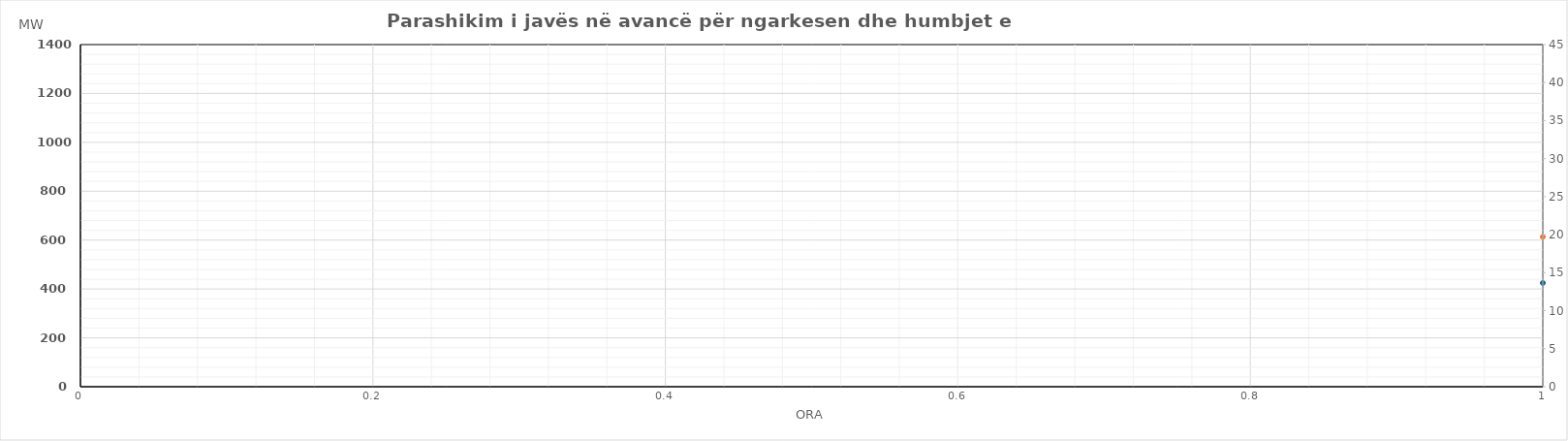
| Category | Ngarkesa (MWh) |
|---|---|
| 0 | 613.19 |
| 1 | 549.8 |
| 2 | 565.19 |
| 3 | 551.39 |
| 4 | 561.67 |
| 5 | 630.08 |
| 6 | 814.47 |
| 7 | 1036.56 |
| 8 | 1102.48 |
| 9 | 1117.12 |
| 10 | 1083.01 |
| 11 | 1054.55 |
| 12 | 1052.07 |
| 13 | 1086.06 |
| 14 | 1036.25 |
| 15 | 1050.73 |
| 16 | 1061.2 |
| 17 | 1144.82 |
| 18 | 1233.29 |
| 19 | 1218.99 |
| 20 | 1171.6 |
| 21 | 1056.33 |
| 22 | 897.54 |
| 23 | 754.32 |
| 24 | 588.33 |
| 25 | 546.78 |
| 26 | 538.25 |
| 27 | 527.83 |
| 28 | 536.96 |
| 29 | 609.31 |
| 30 | 777.93 |
| 31 | 986.44 |
| 32 | 1058.18 |
| 33 | 1057.33 |
| 34 | 1006.15 |
| 35 | 945.26 |
| 36 | 949.11 |
| 37 | 966.95 |
| 38 | 1017.96 |
| 39 | 1006 |
| 40 | 1044.46 |
| 41 | 1118.68 |
| 42 | 1134.24 |
| 43 | 1137.63 |
| 44 | 1109.39 |
| 45 | 1000.72 |
| 46 | 843.01 |
| 47 | 648.72 |
| 48 | 652.87 |
| 49 | 570.81 |
| 50 | 594.7 |
| 51 | 582.69 |
| 52 | 580.59 |
| 53 | 657.39 |
| 54 | 792.99 |
| 55 | 1001.88 |
| 56 | 1058.61 |
| 57 | 1073.21 |
| 58 | 1028.79 |
| 59 | 936.78 |
| 60 | 927.8 |
| 61 | 965.26 |
| 62 | 937.05 |
| 63 | 947.62 |
| 64 | 961 |
| 65 | 1033.14 |
| 66 | 1157.49 |
| 67 | 1162.89 |
| 68 | 1137.51 |
| 69 | 1039.12 |
| 70 | 851.12 |
| 71 | 713.52 |
| 72 | 616.9 |
| 73 | 552.39 |
| 74 | 572.91 |
| 75 | 572.6 |
| 76 | 573.29 |
| 77 | 638.4 |
| 78 | 767.99 |
| 79 | 952.29 |
| 80 | 1056.52 |
| 81 | 1052.72 |
| 82 | 977.71 |
| 83 | 859.9 |
| 84 | 837.62 |
| 85 | 840.32 |
| 86 | 809.6 |
| 87 | 837.39 |
| 88 | 869.61 |
| 89 | 1055.94 |
| 90 | 1130.7 |
| 91 | 1147 |
| 92 | 1120.61 |
| 93 | 1018.43 |
| 94 | 884.12 |
| 95 | 736.89 |
| 96 | 582 |
| 97 | 528.19 |
| 98 | 547.51 |
| 99 | 546.81 |
| 100 | 543.19 |
| 101 | 607.5 |
| 102 | 728.29 |
| 103 | 916.39 |
| 104 | 1030.02 |
| 105 | 1024.42 |
| 106 | 969.01 |
| 107 | 922.2 |
| 108 | 885.12 |
| 109 | 882.12 |
| 110 | 852 |
| 111 | 837.39 |
| 112 | 906.71 |
| 113 | 1038.84 |
| 114 | 1149.9 |
| 115 | 1151.4 |
| 116 | 1119.41 |
| 117 | 1023.73 |
| 118 | 867.52 |
| 119 | 723.59 |
| 120 | 612.9 |
| 121 | 567.39 |
| 122 | 536.81 |
| 123 | 546.7 |
| 124 | 557.79 |
| 125 | 593.7 |
| 126 | 706.49 |
| 127 | 858.69 |
| 128 | 962.32 |
| 129 | 969.42 |
| 130 | 956.31 |
| 131 | 922 |
| 132 | 915.72 |
| 133 | 921.42 |
| 134 | 928.6 |
| 135 | 912.29 |
| 136 | 877.51 |
| 137 | 1018.14 |
| 138 | 1113.5 |
| 139 | 1110.7 |
| 140 | 1078.51 |
| 141 | 988.23 |
| 142 | 846.52 |
| 143 | 677.89 |
| 144 | 664.4 |
| 145 | 608.3 |
| 146 | 552.9 |
| 147 | 532.87 |
| 148 | 535.68 |
| 149 | 598.94 |
| 150 | 670.75 |
| 151 | 824.43 |
| 152 | 921.86 |
| 153 | 939.79 |
| 154 | 910.58 |
| 155 | 889.88 |
| 156 | 836.04 |
| 157 | 843.13 |
| 158 | 840.97 |
| 159 | 855.67 |
| 160 | 836.29 |
| 161 | 989.96 |
| 162 | 1113.22 |
| 163 | 1132.71 |
| 164 | 1107.2 |
| 165 | 998.95 |
| 166 | 843.73 |
| 167 | 652.09 |